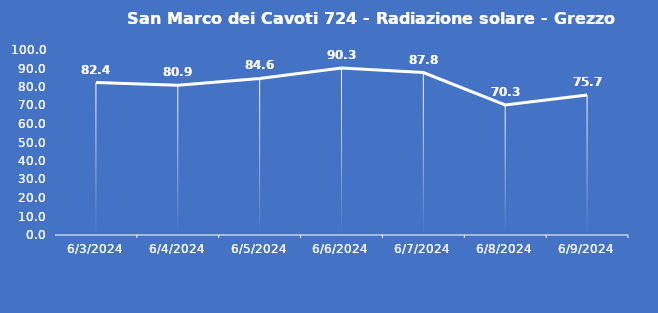
| Category | San Marco dei Cavoti 724 - Radiazione solare - Grezzo (W/m2) |
|---|---|
| 6/3/24 | 82.4 |
| 6/4/24 | 80.9 |
| 6/5/24 | 84.6 |
| 6/6/24 | 90.3 |
| 6/7/24 | 87.8 |
| 6/8/24 | 70.3 |
| 6/9/24 | 75.7 |